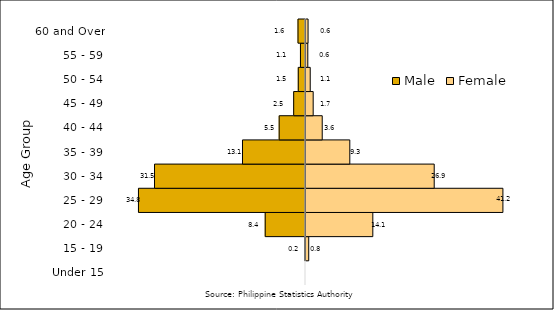
| Category | Male | Female |
|---|---|---|
| Under 15 | 0 | 0 |
| 15 - 19 | -0.166 | 0.778 |
| 20 - 24 | -8.395 | 14.13 |
| 25 - 29 | -34.798 | 41.233 |
| 30 - 34 | -31.454 | 26.918 |
| 35 - 39 | -13.126 | 9.336 |
| 40 - 44 | -5.482 | 3.588 |
| 45 - 49 | -2.462 | 1.704 |
| 50 - 54 | -1.506 | 1.09 |
| 55 - 59 | -1.051 | 0.585 |
| 60 and Over | -1.56 | 0.639 |